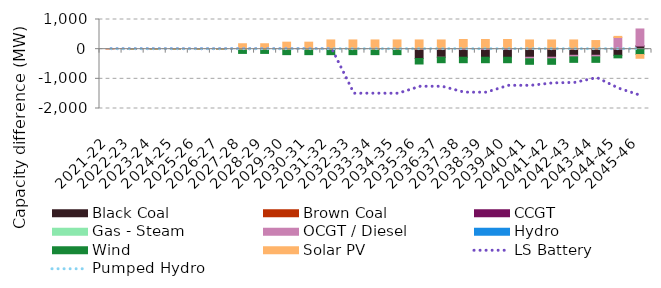
| Category | Black Coal | Brown Coal | CCGT | Gas - Steam | OCGT / Diesel | Hydro | Wind | Solar PV |
|---|---|---|---|---|---|---|---|---|
| 2021-22 | 0 | 0 | 0 | 0 | 0 | 0 | 0 | 0.001 |
| 2022-23 | 0 | 0 | 0 | 0 | 0 | 0 | 0.003 | 0 |
| 2023-24 | 0 | 0 | 0 | 0 | 0 | 0 | 0.004 | -0.001 |
| 2024-25 | 0 | 0 | 0 | 0 | 0 | 0 | 0.004 | -0.002 |
| 2025-26 | 0 | 0 | 0 | 0 | 0 | 0 | 0.001 | 0.003 |
| 2026-27 | 0 | 0 | 0 | 0 | 0 | 0 | 0.001 | 0.004 |
| 2027-28 | 0 | 0 | 0 | 0 | 0 | 0 | -143.218 | 182.811 |
| 2028-29 | 0.001 | 0 | 0 | 0 | 0 | 0 | -143.219 | 182.812 |
| 2029-30 | 0 | 0 | 0 | 0 | 0 | 0 | -184.814 | 235.906 |
| 2030-31 | 0 | 0 | 0 | 0 | 0 | 0 | -184.814 | 235.906 |
| 2031-32 | 0 | 0 | 0 | 0 | 0 | 0 | -184.814 | 311.037 |
| 2032-33 | -0.002 | 0 | 0 | 0 | 0 | 0 | -184.814 | 311.037 |
| 2033-34 | -0.002 | 0 | 0 | 0 | 0 | 0 | -184.813 | 311.037 |
| 2034-35 | -0.002 | 0 | 0 | 0 | 0 | 0 | -184.813 | 311.037 |
| 2035-36 | -315.177 | 0 | 0 | 0 | 0 | 0 | -184.812 | 311.038 |
| 2036-37 | -271.686 | 0 | 0 | 0 | -0.002 | 0 | -184.814 | 311.037 |
| 2037-38 | -271.686 | 0 | 0 | 0 | 14.203 | 0 | -184.814 | 311.033 |
| 2038-39 | -271.686 | 0 | 0 | 0 | 14.203 | 0 | -184.812 | 311.034 |
| 2039-40 | -271.686 | 0 | 0 | 0 | 14.202 | 0 | -184.811 | 311.034 |
| 2040-41 | -271.686 | 0 | 0 | 0 | -53.796 | 0 | -184.809 | 311.039 |
| 2041-42 | -271.686 | 0 | 0.001 | 0 | -53.797 | 0 | -184.803 | 311.037 |
| 2042-43 | -205.836 | 0 | 0 | 0 | -53.823 | 0 | -184.804 | 311.035 |
| 2043-44 | -205.836 | 0 | 0.001 | 0 | -53.796 | 0 | -184.805 | 290.924 |
| 2044-45 | -205.835 | 0 | 0 | 0 | 393.557 | 0 | -86.706 | 37.747 |
| 2045-46 | 109.34 | 0 | 0.001 | 0 | 571.526 | 0 | -181.09 | -125.605 |